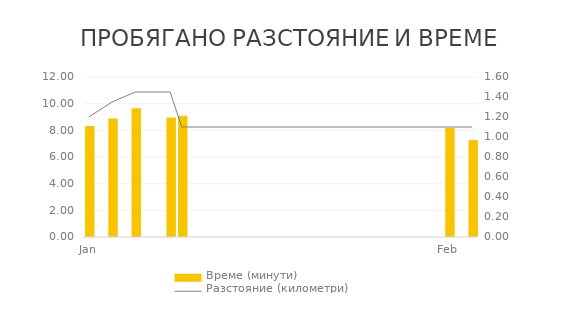
| Category | Време (минути) |
|---|---|
| 2012-01-01 | 8.333 |
| 2012-01-03 | 8.889 |
| 2012-01-05 | 9.655 |
| 2012-01-08 | 8.966 |
| 2012-01-09 | 9.091 |
| 2012-02-01 | 8.182 |
| 2012-02-03 | 7.273 |